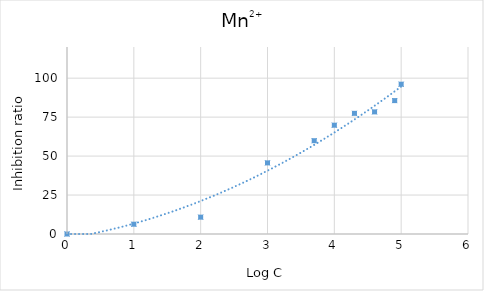
| Category | Mn2+ |
|---|---|
| 0.0 | 0 |
| 1.0 | 6.283 |
| 2.0 | 10.813 |
| 3.0 | 45.637 |
| 3.6989700043360187 | 59.861 |
| 4.0 | 69.821 |
| 4.301029995663981 | 77.432 |
| 4.6020599913279625 | 78.36 |
| 4.903089986991944 | 85.597 |
| 5.0 | 96.13 |